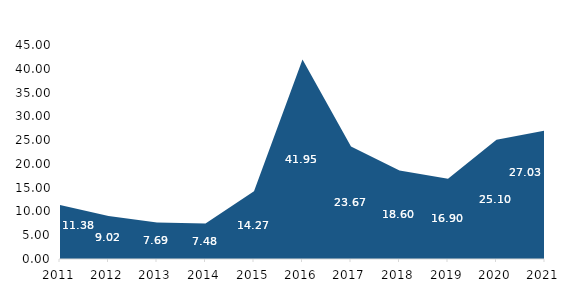
| Category | Taxa de Inflação Acumulada |
|---|---|
| 2011.0 | 11.38 |
| 2012.0 | 9.02 |
| 2013.0 | 7.69 |
| 2014.0 | 7.48 |
| 2015.0 | 14.27 |
| 2016.0 | 41.95 |
| 2017.0 | 23.67 |
| 2018.0 | 18.6 |
| 2019.0 | 16.9 |
| 2020.0 | 25.1 |
| 2021.0 | 27.03 |